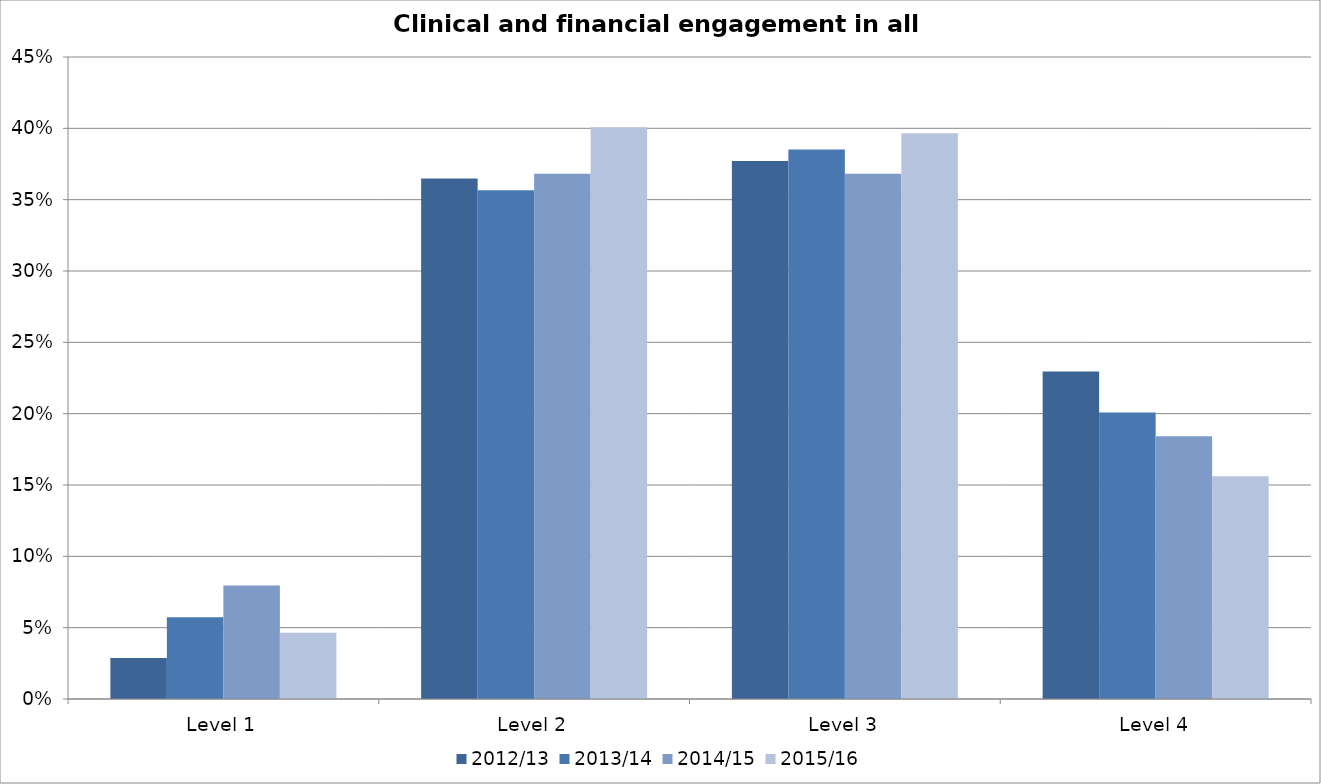
| Category | 2012/13 | 2013/14 | 2014/15 | 2015/16 |
|---|---|---|---|---|
| Level 1 | 0.029 | 0.057 | 0.079 | 0.046 |
| Level 2 | 0.365 | 0.357 | 0.368 | 0.401 |
| Level 3 | 0.377 | 0.385 | 0.368 | 0.397 |
| Level 4 | 0.23 | 0.201 | 0.184 | 0.156 |